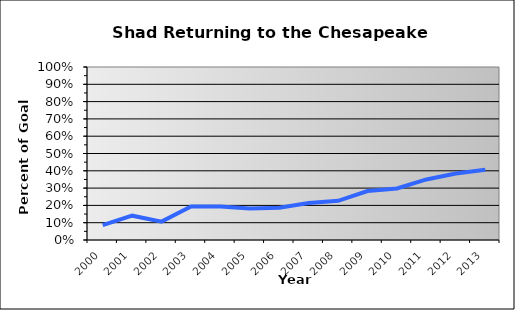
| Category | Baywide Percent Achieved |
|---|---|
| 2000.0 | 0.086 |
| 2001.0 | 0.141 |
| 2002.0 | 0.106 |
| 2003.0 | 0.194 |
| 2004.0 | 0.194 |
| 2005.0 | 0.182 |
| 2006.0 | 0.187 |
| 2007.0 | 0.214 |
| 2008.0 | 0.227 |
| 2009.0 | 0.283 |
| 2010.0 | 0.298 |
| 2011.0 | 0.35 |
| 2012.0 | 0.385 |
| 2013.0 | 0.406 |